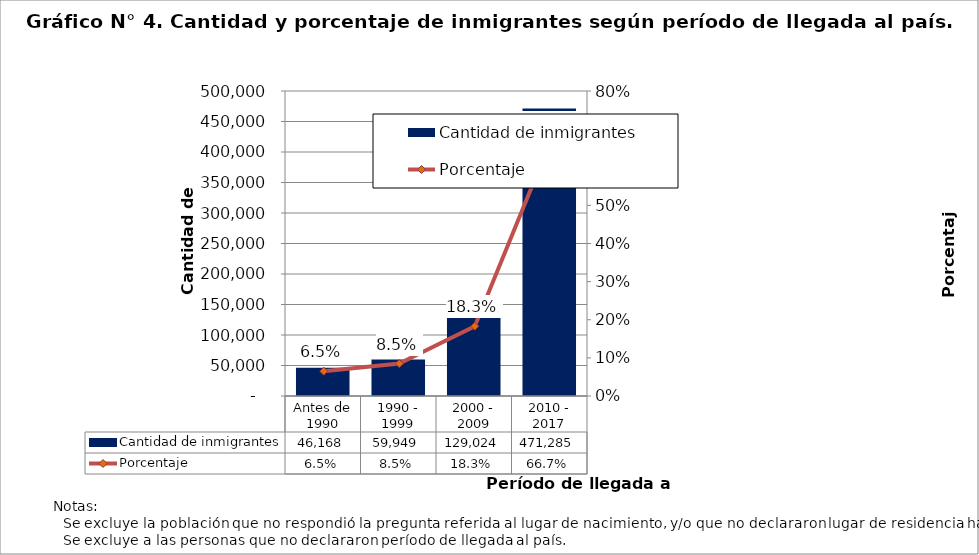
| Category | Cantidad de inmigrantes |
|---|---|
| Antes de 1990 | 46168 |
| 1990 - 1999 | 59949 |
| 2000 - 2009 | 129024 |
| 2010 - 2017 | 471285 |